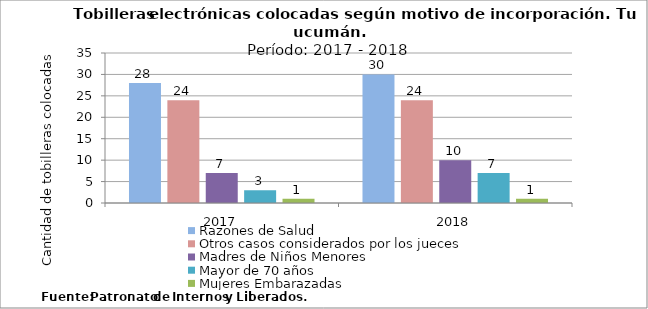
| Category | Razones de Salud | Otros casos considerados por los jueces | Madres de Niños Menores | Mayor de 70 años | Mujeres Embarazadas |
|---|---|---|---|---|---|
| 2017.0 | 28 | 24 | 7 | 3 | 1 |
| 2018.0 | 30 | 24 | 10 | 7 | 1 |